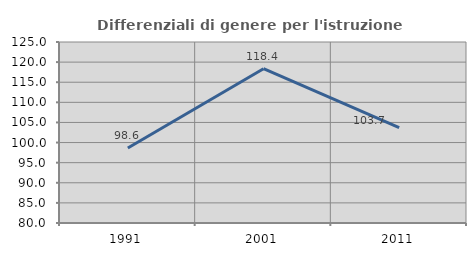
| Category | Differenziali di genere per l'istruzione superiore |
|---|---|
| 1991.0 | 98.648 |
| 2001.0 | 118.351 |
| 2011.0 | 103.725 |